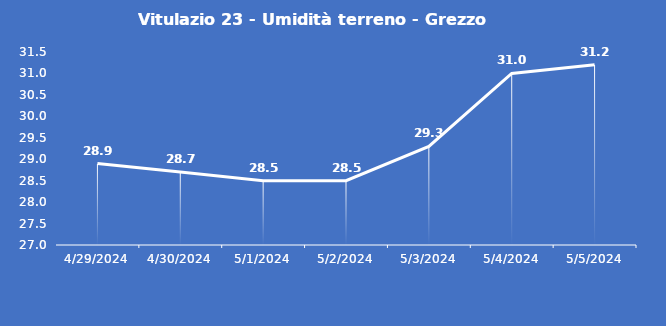
| Category | Vitulazio 23 - Umidità terreno - Grezzo (%VWC) |
|---|---|
| 4/29/24 | 28.9 |
| 4/30/24 | 28.7 |
| 5/1/24 | 28.5 |
| 5/2/24 | 28.5 |
| 5/3/24 | 29.3 |
| 5/4/24 | 31 |
| 5/5/24 | 31.2 |